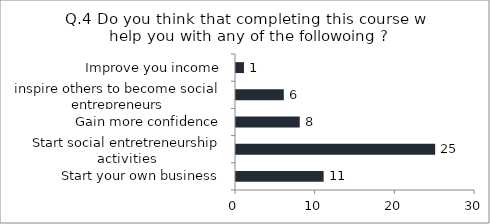
| Category | Q.4 Do you think that completing this course will help you with any of the followoing ? |
|---|---|
| Start your own business | 11 |
| Start social entretreneurship activities | 25 |
| Gain more confidence | 8 |
| inspire others to become social entrepreneurs | 6 |
| Improve you income | 1 |